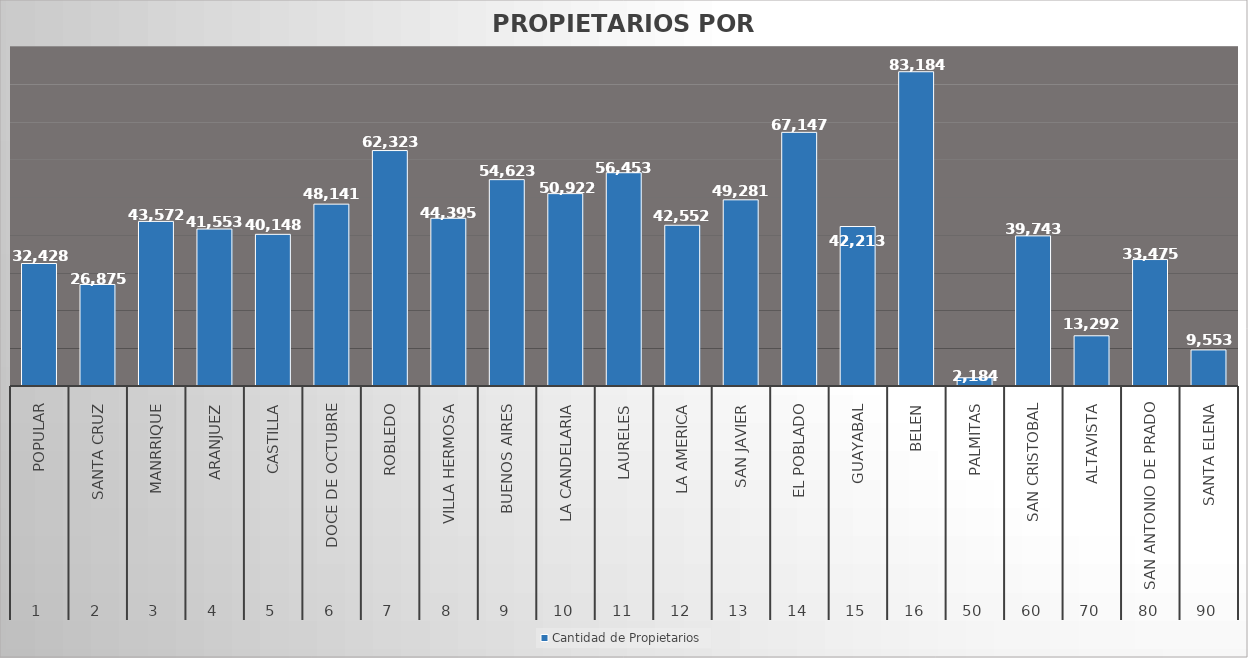
| Category | Cantidad de Propietarios |
|---|---|
| 0 | 32428 |
| 1 | 26875 |
| 2 | 43572 |
| 3 | 41553 |
| 4 | 40148 |
| 5 | 48141 |
| 6 | 62323 |
| 7 | 44395 |
| 8 | 54623 |
| 9 | 50922 |
| 10 | 56453 |
| 11 | 42552 |
| 12 | 49281 |
| 13 | 67147 |
| 14 | 42213 |
| 15 | 83184 |
| 16 | 2184 |
| 17 | 39743 |
| 18 | 13292 |
| 19 | 33475 |
| 20 | 9553 |